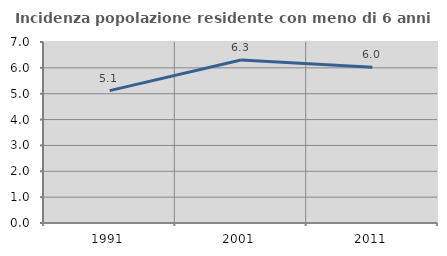
| Category | Incidenza popolazione residente con meno di 6 anni |
|---|---|
| 1991.0 | 5.12 |
| 2001.0 | 6.307 |
| 2011.0 | 6.027 |